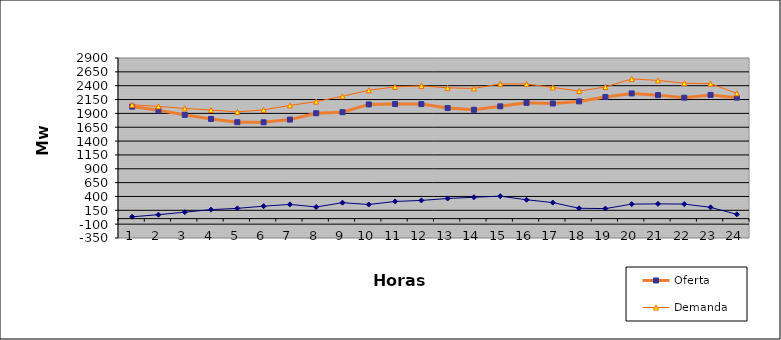
| Category | Oferta | Demanda | No Servida |
|---|---|---|---|
| 1.0 | 2021.98 | 2054.866 | 32.886 |
| 2.0 | 1955.44 | 2026.108 | 70.668 |
| 3.0 | 1872.73 | 1989.014 | 116.284 |
| 4.0 | 1799.44 | 1961.511 | 162.071 |
| 5.0 | 1740.46 | 1925.781 | 185.321 |
| 6.0 | 1739.11 | 1963.783 | 224.673 |
| 7.0 | 1787.92 | 2044.126 | 256.206 |
| 8.0 | 1902.24 | 2112.735 | 210.495 |
| 9.0 | 1921.48 | 2208.785 | 287.305 |
| 10.0 | 2061.8 | 2316.414 | 254.614 |
| 11.0 | 2069.06 | 2378.776 | 309.716 |
| 12.0 | 2068.55 | 2396.874 | 328.324 |
| 13.0 | 1996.84 | 2360.606 | 363.766 |
| 14.0 | 1965.45 | 2351.046 | 385.596 |
| 15.0 | 2027.43 | 2432.431 | 405.001 |
| 16.0 | 2090.62 | 2430.996 | 340.376 |
| 17.0 | 2078.68 | 2368.042 | 289.362 |
| 18.0 | 2116.35 | 2302.818 | 186.468 |
| 19.0 | 2195.36 | 2376.161 | 180.801 |
| 20.0 | 2260.93 | 2522.584 | 261.654 |
| 21.0 | 2229.56 | 2495.655 | 266.095 |
| 22.0 | 2183.07 | 2445.569 | 262.499 |
| 23.0 | 2232.99 | 2436.58 | 203.59 |
| 24.0 | 2184.35 | 2261.6 | 77.25 |